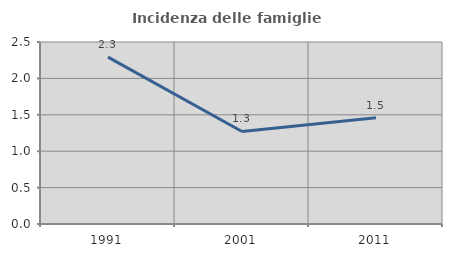
| Category | Incidenza delle famiglie numerose |
|---|---|
| 1991.0 | 2.293 |
| 2001.0 | 1.271 |
| 2011.0 | 1.459 |